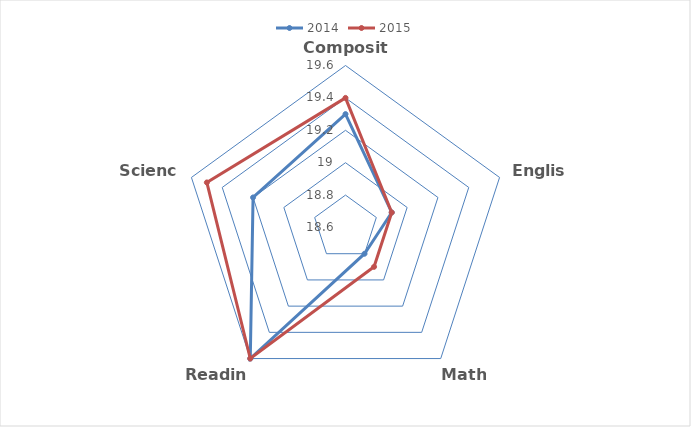
| Category | 2014 | 2015 |
|---|---|---|
| Composite | 19.3 | 19.4 |
| English | 18.9 | 18.9 |
| Math | 18.8 | 18.9 |
| Reading | 19.6 | 19.6 |
| Science | 19.2 | 19.5 |